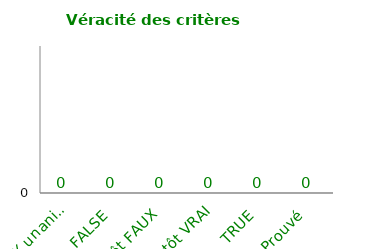
| Category | Series 0 |
|---|---|
| FAUX unanime | 0 |
| FAUX | 0 |
| Plutôt FAUX | 0 |
| Plutôt VRAI | 0 |
| VRAI | 0 |
| VRAI Prouvé | 0 |